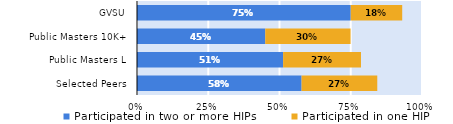
| Category | Participated in two or more HIPs | Participated in one HIP |
|---|---|---|
| Selected Peers | 0.577 | 0.266 |
| Public Masters L | 0.513 | 0.273 |
| Public Masters 10K+ | 0.45 | 0.299 |
| GVSU | 0.75 | 0.181 |